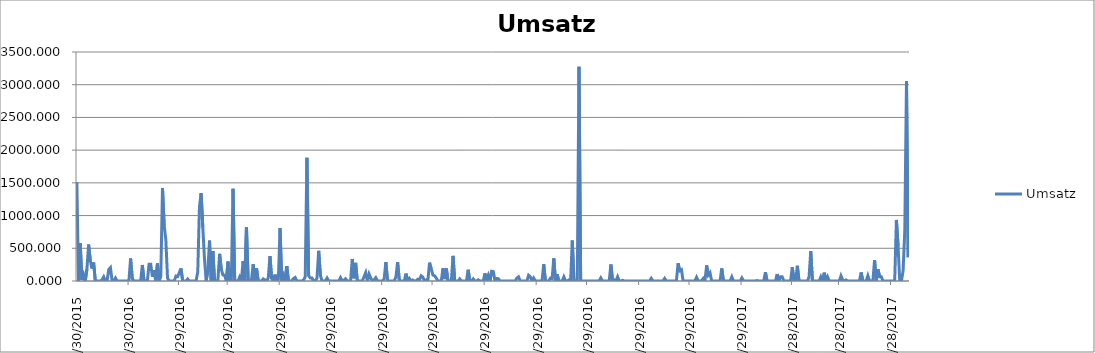
| Category | Umsatz |
|---|---|
| 12/30/15 | 1512 |
| 12/31/15 | 0 |
| 1/1/16 | 578 |
| 1/2/16 | 17 |
| 1/3/16 | 98 |
| 1/4/16 | 0 |
| 1/5/16 | 181 |
| 1/6/16 | 556 |
| 1/7/16 | 315 |
| 1/8/16 | 191 |
| 1/9/16 | 282 |
| 1/10/16 | 0 |
| 1/11/16 | 0 |
| 1/12/16 | 0 |
| 1/13/16 | 0 |
| 1/14/16 | 17 |
| 1/15/16 | 64 |
| 1/16/16 | 0 |
| 1/17/16 | 0 |
| 1/18/16 | 176 |
| 1/19/16 | 205 |
| 1/20/16 | 0 |
| 1/21/16 | 0 |
| 1/22/16 | 46 |
| 1/23/16 | 0 |
| 1/24/16 | 0 |
| 1/25/16 | 0 |
| 1/26/16 | 0 |
| 1/27/16 | 0 |
| 1/28/16 | 0 |
| 1/29/16 | 0 |
| 1/30/16 | 0 |
| 1/31/16 | 344 |
| 2/1/16 | 36 |
| 2/2/16 | 0 |
| 2/3/16 | 0 |
| 2/4/16 | 0 |
| 2/5/16 | 0 |
| 2/6/16 | 0 |
| 2/7/16 | 245 |
| 2/8/16 | 0 |
| 2/9/16 | 2 |
| 2/10/16 | 0 |
| 2/11/16 | 256 |
| 2/12/16 | 256 |
| 2/13/16 | 66 |
| 2/14/16 | 164 |
| 2/15/16 | 0 |
| 2/16/16 | 268 |
| 2/17/16 | 0 |
| 2/18/16 | 81 |
| 2/19/16 | 1421 |
| 2/20/16 | 849 |
| 2/21/16 | 625 |
| 2/22/16 | 44 |
| 2/23/16 | 0 |
| 2/24/16 | 0 |
| 2/25/16 | 0 |
| 2/26/16 | 0 |
| 2/27/16 | 76 |
| 2/28/16 | 67 |
| 2/29/16 | 128 |
| 3/1/16 | 192 |
| 3/2/16 | 3 |
| 3/3/16 | 0 |
| 3/4/16 | 0 |
| 3/5/16 | 30 |
| 3/6/16 | 0 |
| 3/7/16 | 0 |
| 3/8/16 | 0 |
| 3/9/16 | 0 |
| 3/10/16 | 0 |
| 3/11/16 | 140 |
| 3/12/16 | 1126 |
| 3/13/16 | 1344 |
| 3/14/16 | 821 |
| 3/15/16 | 343 |
| 3/16/16 | 0 |
| 3/17/16 | 160 |
| 3/18/16 | 618 |
| 3/19/16 | 0 |
| 3/20/16 | 459 |
| 3/21/16 | 0 |
| 3/22/16 | 0 |
| 3/23/16 | 16 |
| 3/24/16 | 415 |
| 3/25/16 | 182 |
| 3/26/16 | 92 |
| 3/27/16 | 87 |
| 3/28/16 | 0 |
| 3/29/16 | 296 |
| 3/30/16 | 0 |
| 3/31/16 | 0 |
| 4/1/16 | 1410 |
| 4/2/16 | 0 |
| 4/3/16 | 0 |
| 4/4/16 | 0 |
| 4/5/16 | 64 |
| 4/6/16 | 15 |
| 4/7/16 | 304 |
| 4/8/16 | 0 |
| 4/9/16 | 820 |
| 4/10/16 | 16 |
| 4/11/16 | 0 |
| 4/12/16 | 16 |
| 4/13/16 | 256 |
| 4/14/16 | 0 |
| 4/15/16 | 195 |
| 4/16/16 | 0 |
| 4/17/16 | 0 |
| 4/18/16 | 0 |
| 4/19/16 | 32 |
| 4/20/16 | 16 |
| 4/21/16 | 0 |
| 4/22/16 | 47 |
| 4/23/16 | 380 |
| 4/24/16 | 38 |
| 4/25/16 | 0 |
| 4/26/16 | 99 |
| 4/27/16 | 0 |
| 4/28/16 | 27 |
| 4/29/16 | 806 |
| 4/30/16 | 0 |
| 5/1/16 | 86 |
| 5/2/16 | 0 |
| 5/3/16 | 227 |
| 5/4/16 | 0 |
| 5/5/16 | 0 |
| 5/6/16 | 0 |
| 5/7/16 | 35 |
| 5/8/16 | 53 |
| 5/9/16 | 0 |
| 5/10/16 | 0 |
| 5/11/16 | 0 |
| 5/12/16 | 0 |
| 5/13/16 | 16 |
| 5/14/16 | 64 |
| 5/15/16 | 1883 |
| 5/16/16 | 82 |
| 5/17/16 | 45 |
| 5/18/16 | 45 |
| 5/19/16 | 0 |
| 5/20/16 | 0 |
| 5/21/16 | 44 |
| 5/22/16 | 461 |
| 5/23/16 | 88 |
| 5/24/16 | 0 |
| 5/25/16 | 0 |
| 5/26/16 | 0 |
| 5/27/16 | 45 |
| 5/28/16 | 0 |
| 5/29/16 | 0 |
| 5/30/16 | 0 |
| 5/31/16 | 0 |
| 6/1/16 | 0 |
| 6/2/16 | 0 |
| 6/3/16 | 0 |
| 6/4/16 | 51 |
| 6/5/16 | 0 |
| 6/6/16 | 11 |
| 6/7/16 | 34 |
| 6/8/16 | 0 |
| 6/9/16 | 0 |
| 6/10/16 | 0 |
| 6/11/16 | 337 |
| 6/12/16 | 41 |
| 6/13/16 | 277 |
| 6/14/16 | 0 |
| 6/15/16 | 0 |
| 6/16/16 | 0 |
| 6/17/16 | 0 |
| 6/18/16 | 66 |
| 6/19/16 | 128 |
| 6/20/16 | 0 |
| 6/21/16 | 107 |
| 6/22/16 | 46 |
| 6/23/16 | 0 |
| 6/24/16 | 16 |
| 6/25/16 | 51 |
| 6/26/16 | 0 |
| 6/27/16 | 0 |
| 6/28/16 | 0 |
| 6/29/16 | 0 |
| 6/30/16 | 32 |
| 7/1/16 | 288 |
| 7/2/16 | 0 |
| 7/3/16 | 0 |
| 7/4/16 | 0 |
| 7/5/16 | 0 |
| 7/6/16 | 0 |
| 7/7/16 | 64 |
| 7/8/16 | 288 |
| 7/9/16 | 10 |
| 7/10/16 | 0 |
| 7/11/16 | 0 |
| 7/12/16 | 0 |
| 7/13/16 | 113 |
| 7/14/16 | 0 |
| 7/15/16 | 38 |
| 7/16/16 | 0 |
| 7/17/16 | 15 |
| 7/18/16 | 0 |
| 7/19/16 | 0 |
| 7/20/16 | 27 |
| 7/21/16 | 16 |
| 7/22/16 | 79 |
| 7/23/16 | 61 |
| 7/24/16 | 0 |
| 7/25/16 | 16 |
| 7/26/16 | 0 |
| 7/27/16 | 280 |
| 7/28/16 | 188 |
| 7/29/16 | 92 |
| 7/30/16 | 80 |
| 7/31/16 | 45 |
| 8/1/16 | 0 |
| 8/2/16 | 0 |
| 8/3/16 | 0 |
| 8/4/16 | 192 |
| 8/5/16 | 29 |
| 8/6/16 | 192 |
| 8/7/16 | 0 |
| 8/8/16 | 0 |
| 8/9/16 | 0 |
| 8/10/16 | 384 |
| 8/11/16 | 0 |
| 8/12/16 | 0 |
| 8/13/16 | 0 |
| 8/14/16 | 32 |
| 8/15/16 | 0 |
| 8/16/16 | 0 |
| 8/17/16 | 0 |
| 8/18/16 | 0 |
| 8/19/16 | 172 |
| 8/20/16 | 0 |
| 8/21/16 | 0 |
| 8/22/16 | 32 |
| 8/23/16 | 0 |
| 8/24/16 | 0 |
| 8/25/16 | 18 |
| 8/26/16 | 0 |
| 8/27/16 | 0 |
| 8/28/16 | 0 |
| 8/29/16 | 116 |
| 8/30/16 | 16 |
| 8/31/16 | 88 |
| 9/1/16 | 0 |
| 9/2/16 | 149 |
| 9/3/16 | 144 |
| 9/4/16 | 0 |
| 9/5/16 | 37 |
| 9/6/16 | 36 |
| 9/7/16 | 0 |
| 9/8/16 | 0 |
| 9/9/16 | 0 |
| 9/10/16 | 0 |
| 9/11/16 | 0 |
| 9/12/16 | 0 |
| 9/13/16 | 0 |
| 9/14/16 | 0 |
| 9/15/16 | 0 |
| 9/16/16 | 0 |
| 9/17/16 | 44 |
| 9/18/16 | 64 |
| 9/19/16 | 0 |
| 9/20/16 | 0 |
| 9/21/16 | 0 |
| 9/22/16 | 0 |
| 9/23/16 | 0 |
| 9/24/16 | 88 |
| 9/25/16 | 64 |
| 9/26/16 | 0 |
| 9/27/16 | 46 |
| 9/28/16 | 0 |
| 9/29/16 | 0 |
| 9/30/16 | 0 |
| 10/1/16 | 0 |
| 10/2/16 | 0 |
| 10/3/16 | 256 |
| 10/4/16 | 0 |
| 10/5/16 | 0 |
| 10/6/16 | 0 |
| 10/7/16 | 43 |
| 10/8/16 | 34 |
| 10/9/16 | 347 |
| 10/10/16 | 0 |
| 10/11/16 | 102 |
| 10/12/16 | 0 |
| 10/13/16 | 0 |
| 10/14/16 | 0 |
| 10/15/16 | 64 |
| 10/16/16 | 0 |
| 10/17/16 | 0 |
| 10/18/16 | 16 |
| 10/19/16 | 0 |
| 10/20/16 | 619 |
| 10/21/16 | 0 |
| 10/22/16 | 0 |
| 10/23/16 | 0 |
| 10/24/16 | 3273 |
| 10/25/16 | 0 |
| 10/26/16 | 0 |
| 10/27/16 | 0 |
| 10/28/16 | 0 |
| 10/29/16 | 0 |
| 10/30/16 | 0 |
| 10/31/16 | 0 |
| 11/1/16 | 0 |
| 11/2/16 | 0 |
| 11/3/16 | 0 |
| 11/4/16 | 0 |
| 11/5/16 | 0 |
| 11/6/16 | 47 |
| 11/7/16 | 0 |
| 11/8/16 | 0 |
| 11/9/16 | 0 |
| 11/10/16 | 0 |
| 11/11/16 | 0 |
| 11/12/16 | 252 |
| 11/13/16 | 0 |
| 11/14/16 | 16 |
| 11/15/16 | 0 |
| 11/16/16 | 65 |
| 11/17/16 | 0 |
| 11/18/16 | 0 |
| 11/19/16 | 10 |
| 11/20/16 | 0 |
| 11/21/16 | 0 |
| 11/22/16 | 0 |
| 11/23/16 | 0 |
| 11/24/16 | 0 |
| 11/25/16 | 0 |
| 11/26/16 | 0 |
| 11/27/16 | 0 |
| 11/28/16 | 0 |
| 11/29/16 | 0 |
| 11/30/16 | 0 |
| 12/1/16 | 0 |
| 12/2/16 | 0 |
| 12/3/16 | 0 |
| 12/4/16 | 0 |
| 12/5/16 | 0 |
| 12/6/16 | 41 |
| 12/7/16 | 0 |
| 12/8/16 | 0 |
| 12/9/16 | 0 |
| 12/10/16 | 0 |
| 12/11/16 | 0 |
| 12/12/16 | 0 |
| 12/13/16 | 0 |
| 12/14/16 | 39 |
| 12/15/16 | 0 |
| 12/16/16 | 0 |
| 12/17/16 | 0 |
| 12/18/16 | 0 |
| 12/19/16 | 0 |
| 12/20/16 | 0 |
| 12/21/16 | 0 |
| 12/22/16 | 270 |
| 12/23/16 | 156 |
| 12/24/16 | 172 |
| 12/25/16 | 0 |
| 12/26/16 | 0 |
| 12/27/16 | 0 |
| 12/28/16 | 0 |
| 12/29/16 | 0 |
| 12/30/16 | 0 |
| 12/31/16 | 0 |
| 1/1/17 | 0 |
| 1/2/17 | 57 |
| 1/3/17 | 0 |
| 1/4/17 | 0 |
| 1/5/17 | 0 |
| 1/6/17 | 39 |
| 1/7/17 | 0 |
| 1/8/17 | 238 |
| 1/9/17 | 92 |
| 1/10/17 | 128 |
| 1/11/17 | 0 |
| 1/12/17 | 0 |
| 1/13/17 | 0 |
| 1/14/17 | 0 |
| 1/15/17 | 0 |
| 1/16/17 | 0 |
| 1/17/17 | 192 |
| 1/18/17 | 0 |
| 1/19/17 | 0 |
| 1/20/17 | 0 |
| 1/21/17 | 0 |
| 1/22/17 | 0 |
| 1/23/17 | 64 |
| 1/24/17 | 0 |
| 1/25/17 | 0 |
| 1/26/17 | 0 |
| 1/27/17 | 0 |
| 1/28/17 | 0 |
| 1/29/17 | 47 |
| 1/30/17 | 0 |
| 1/31/17 | 0 |
| 2/1/17 | 0 |
| 2/2/17 | 0 |
| 2/3/17 | 0 |
| 2/4/17 | 0 |
| 2/5/17 | 0 |
| 2/6/17 | 0 |
| 2/7/17 | 7 |
| 2/8/17 | 0 |
| 2/9/17 | 0 |
| 2/10/17 | 0 |
| 2/11/17 | 0 |
| 2/12/17 | 133 |
| 2/13/17 | 0 |
| 2/14/17 | 0 |
| 2/15/17 | 0 |
| 2/16/17 | 0 |
| 2/17/17 | 0 |
| 2/18/17 | 0 |
| 2/19/17 | 106 |
| 2/20/17 | 0 |
| 2/21/17 | 64 |
| 2/22/17 | 64 |
| 2/23/17 | 0 |
| 2/24/17 | 0 |
| 2/25/17 | 0 |
| 2/26/17 | 0 |
| 2/27/17 | 0 |
| 2/28/17 | 210 |
| 3/1/17 | 0 |
| 3/2/17 | 0 |
| 3/3/17 | 233 |
| 3/4/17 | 0 |
| 3/5/17 | 0 |
| 3/6/17 | 0 |
| 3/7/17 | 0 |
| 3/8/17 | 0 |
| 3/9/17 | 0 |
| 3/10/17 | 64 |
| 3/11/17 | 455 |
| 3/12/17 | 0 |
| 3/13/17 | 0 |
| 3/14/17 | 1 |
| 3/15/17 | 0 |
| 3/16/17 | 0 |
| 3/17/17 | 64 |
| 3/18/17 | 0 |
| 3/19/17 | 128 |
| 3/20/17 | 0 |
| 3/21/17 | 64 |
| 3/22/17 | 0 |
| 3/23/17 | 0 |
| 3/24/17 | 0 |
| 3/25/17 | 0 |
| 3/26/17 | 0 |
| 3/27/17 | 0 |
| 3/28/17 | 0 |
| 3/29/17 | 79 |
| 3/30/17 | 16 |
| 3/31/17 | 0 |
| 4/1/17 | 16 |
| 4/2/17 | 0 |
| 4/3/17 | 0 |
| 4/4/17 | 0 |
| 4/5/17 | 0 |
| 4/6/17 | 0 |
| 4/7/17 | 0 |
| 4/8/17 | 0 |
| 4/9/17 | 0 |
| 4/10/17 | 131 |
| 4/11/17 | 0 |
| 4/12/17 | 0 |
| 4/13/17 | 0 |
| 4/14/17 | 82 |
| 4/15/17 | 0 |
| 4/16/17 | 0 |
| 4/17/17 | 0 |
| 4/18/17 | 319 |
| 4/19/17 | 0 |
| 4/20/17 | 180 |
| 4/21/17 | 64 |
| 4/22/17 | 65 |
| 4/23/17 | 0 |
| 4/24/17 | 0 |
| 4/25/17 | 0 |
| 4/26/17 | 0 |
| 4/27/17 | 0 |
| 4/28/17 | 0 |
| 4/29/17 | 1 |
| 4/30/17 | 16 |
| 5/1/17 | 933 |
| 5/2/17 | 533 |
| 5/3/17 | 0 |
| 5/4/17 | 0 |
| 5/5/17 | 160 |
| 5/6/17 | 775 |
| 5/7/17 | 3057 |
| 5/8/17 | 362 |